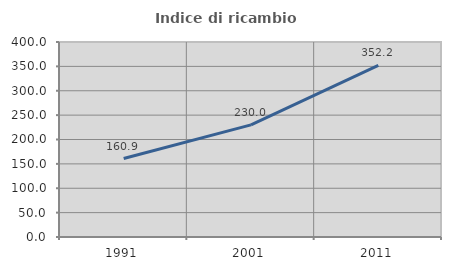
| Category | Indice di ricambio occupazionale  |
|---|---|
| 1991.0 | 160.911 |
| 2001.0 | 229.979 |
| 2011.0 | 352.232 |